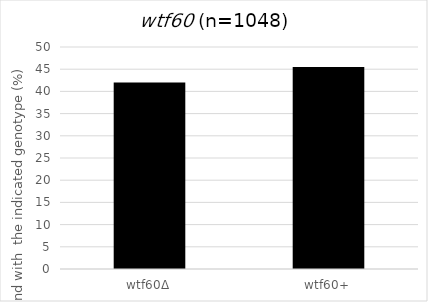
| Category | spores that are viable and with the indicated genotype |
|---|---|
| wtf60Δ | 41.985 |
| wtf60+ | 45.515 |